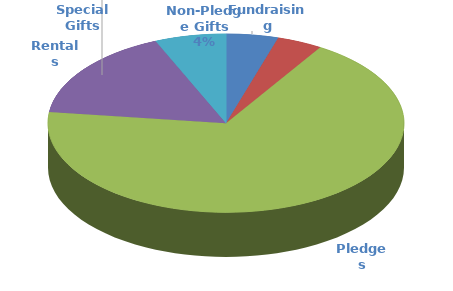
| Category | Total |
|---|---|
| Fundraising | 43500 |
| Non-Pledge Gifts | 38000 |
| Pledges | 627170 |
| Rentals | 152336 |
| Special Gifts | 59500 |